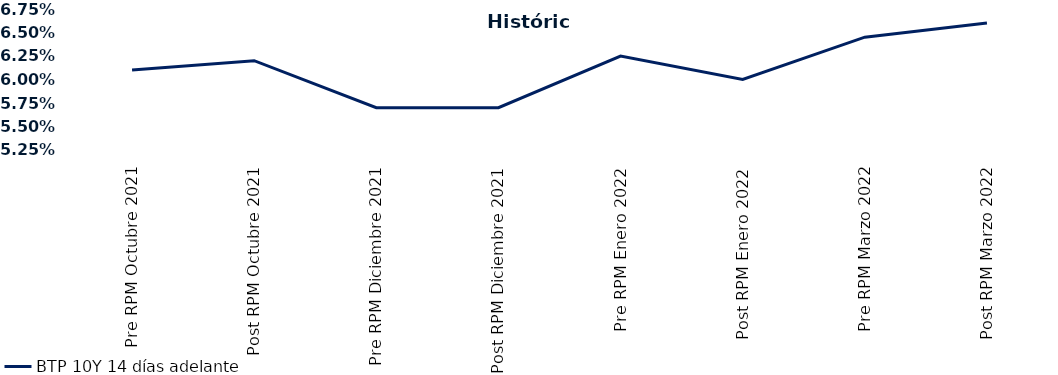
| Category | BTP 10Y 14 días adelante |
|---|---|
| Pre RPM Octubre 2021 | 0.061 |
| Post RPM Octubre 2021 | 0.062 |
| Pre RPM Diciembre 2021 | 0.057 |
| Post RPM Diciembre 2021 | 0.057 |
| Pre RPM Enero 2022 | 0.062 |
| Post RPM Enero 2022 | 0.06 |
| Pre RPM Marzo 2022 | 0.064 |
| Post RPM Marzo 2022 | 0.066 |